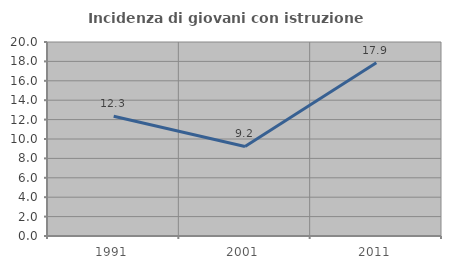
| Category | Incidenza di giovani con istruzione universitaria |
|---|---|
| 1991.0 | 12.346 |
| 2001.0 | 9.231 |
| 2011.0 | 17.857 |